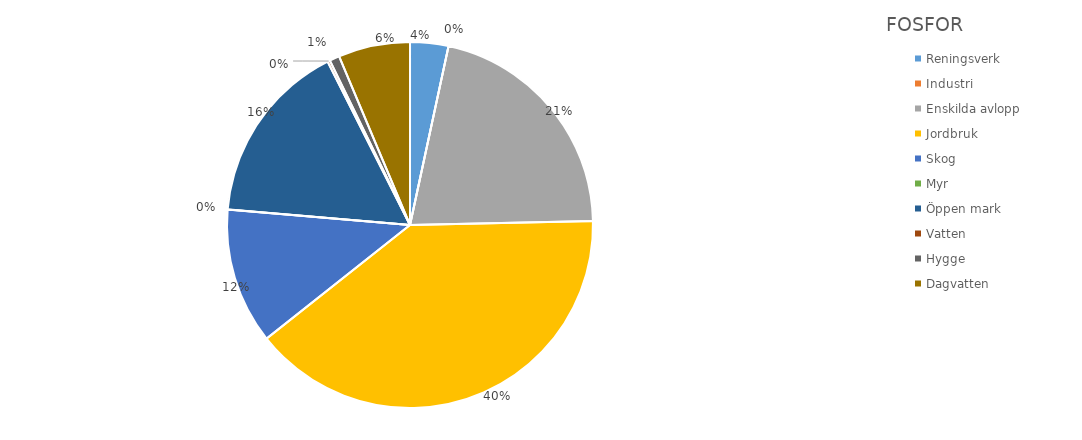
| Category | Series 0 |
|---|---|
| Reningsverk | 247.984 |
| Industri | 0 |
| Enskilda avlopp | 1561 |
| Jordbruk | 2914 |
| Skog | 881 |
| Myr | 1 |
| Öppen mark | 1190 |
| Vatten | 16 |
| Hygge  | 65 |
| Dagvatten | 465 |